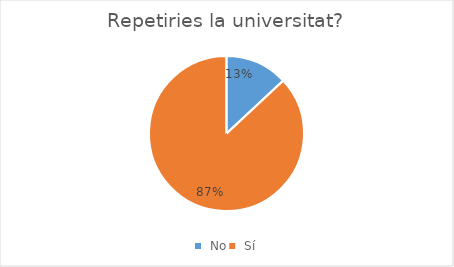
| Category | Series 0 |
|---|---|
|  No | 15 |
|  Sí | 100 |